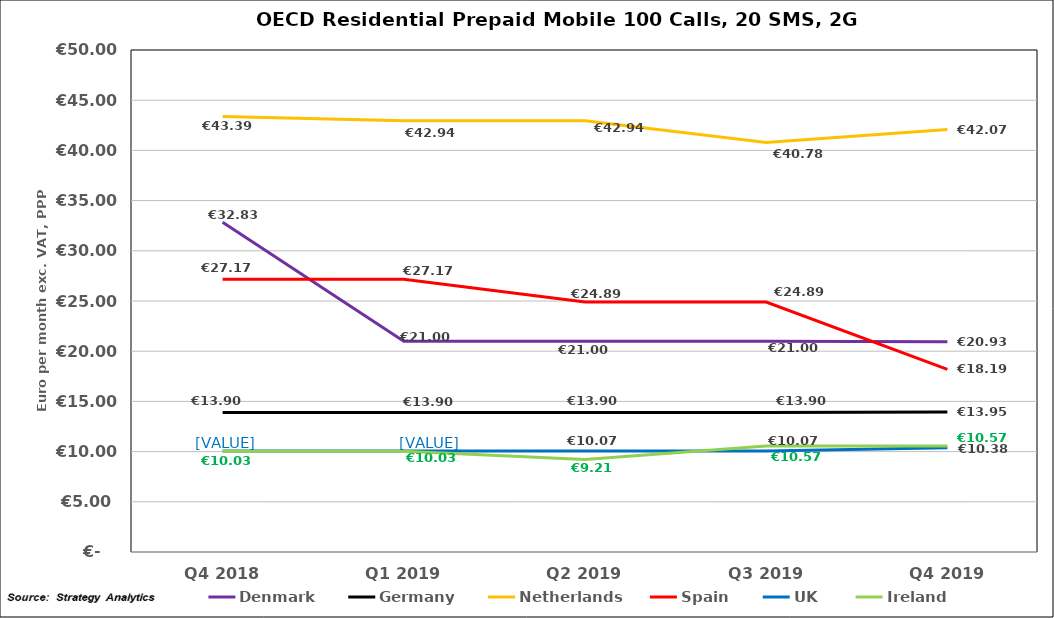
| Category | Denmark | Germany | Netherlands | Spain | UK | Ireland |
|---|---|---|---|---|---|---|
| Q4 2018 | 32.832 | 13.896 | 43.388 | 27.171 | 10.067 | 10.027 |
| Q1 2019 | 21 | 13.896 | 42.945 | 27.171 | 10.067 | 10.027 |
| Q2 2019 | 21 | 13.896 | 42.945 | 24.893 | 10.067 | 9.214 |
| Q3 2019 | 21 | 13.896 | 40.782 | 24.893 | 10.067 | 10.566 |
| Q4 2019 | 20.93 | 13.95 | 42.07 | 18.19 | 10.38 | 10.57 |